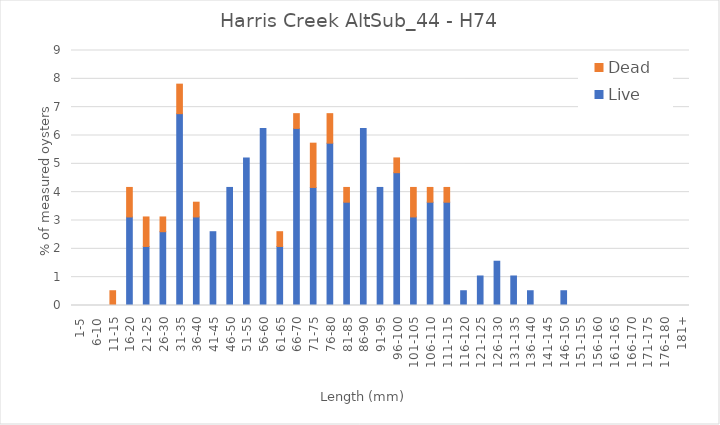
| Category | Live | Dead |
|---|---|---|
| 1-5 | 0 | 0 |
| 6-10 | 0 | 0 |
| 11-15 | 0 | 0.521 |
| 16-20 | 3.125 | 1.042 |
| 21-25 | 2.083 | 1.042 |
| 26-30 | 2.604 | 0.521 |
| 31-35 | 6.771 | 1.042 |
| 36-40 | 3.125 | 0.521 |
| 41-45 | 2.604 | 0 |
| 46-50 | 4.167 | 0 |
| 51-55 | 5.208 | 0 |
| 56-60 | 6.25 | 0 |
| 61-65 | 2.083 | 0.521 |
| 66-70 | 6.25 | 0.521 |
| 71-75 | 4.167 | 1.562 |
| 76-80 | 5.729 | 1.042 |
| 81-85 | 3.646 | 0.521 |
| 86-90 | 6.25 | 0 |
| 91-95 | 4.167 | 0 |
| 96-100 | 4.688 | 0.521 |
| 101-105 | 3.125 | 1.042 |
| 106-110 | 3.646 | 0.521 |
| 111-115 | 3.646 | 0.521 |
| 116-120 | 0.521 | 0 |
| 121-125 | 1.042 | 0 |
| 126-130 | 1.562 | 0 |
| 131-135 | 1.042 | 0 |
| 136-140 | 0.521 | 0 |
| 141-145 | 0 | 0 |
| 146-150 | 0.521 | 0 |
| 151-155 | 0 | 0 |
| 156-160 | 0 | 0 |
| 161-165 | 0 | 0 |
| 166-170 | 0 | 0 |
| 171-175 | 0 | 0 |
| 176-180 | 0 | 0 |
| 181+ | 0 | 0 |